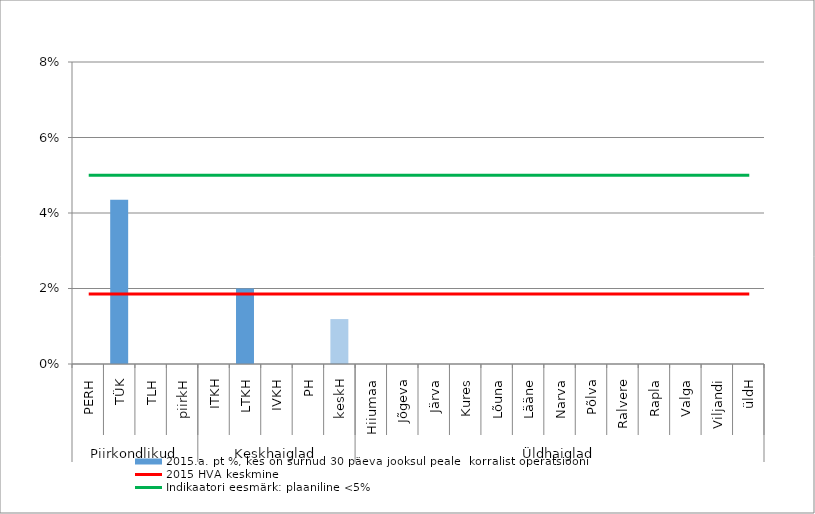
| Category | 2015.a. pt %, kes on surnud 30 päeva jooksul peale  korralist operatsiooni |
|---|---|
| 0 | 0 |
| 1 | 0.043 |
| 2 | 0 |
| 3 | 0 |
| 4 | 0 |
| 5 | 0.02 |
| 6 | 0 |
| 7 | 0 |
| 8 | 0.012 |
| 9 | 0 |
| 10 | 0 |
| 11 | 0 |
| 12 | 0 |
| 13 | 0 |
| 14 | 0 |
| 15 | 0 |
| 16 | 0 |
| 17 | 0 |
| 18 | 0 |
| 19 | 0 |
| 20 | 0 |
| 21 | 0 |